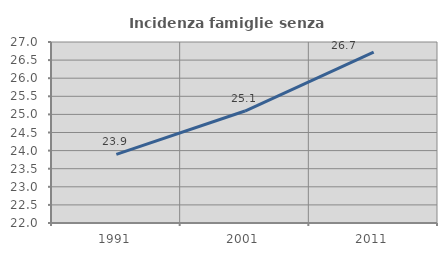
| Category | Incidenza famiglie senza nuclei |
|---|---|
| 1991.0 | 23.896 |
| 2001.0 | 25.093 |
| 2011.0 | 26.721 |